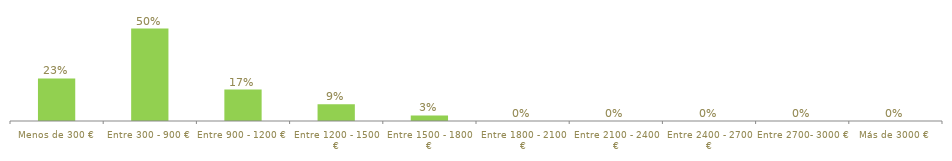
| Category | Series 0 |
|---|---|
| Menos de 300 € | 0.23 |
| Entre 300 - 900 € | 0.5 |
| Entre 900 - 1200 € | 0.17 |
| Entre 1200 - 1500 € | 0.09 |
| Entre 1500 - 1800 € | 0.03 |
| Entre 1800 - 2100 € | 0 |
| Entre 2100 - 2400 € | 0 |
| Entre 2400 - 2700 € | 0 |
| Entre 2700- 3000 € | 0 |
| Más de 3000 € | 0 |